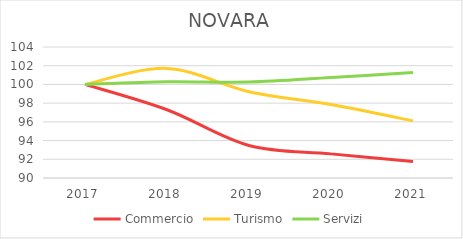
| Category | Commercio | Turismo | Servizi |
|---|---|---|---|
| 2017.0 | 100 | 100 | 100 |
| 2018.0 | 97.291 | 101.713 | 100.291 |
| 2019.0 | 93.473 | 99.221 | 100.251 |
| 2020.0 | 92.578 | 97.846 | 100.736 |
| 2021.0 | 91.756 | 96.107 | 101.269 |